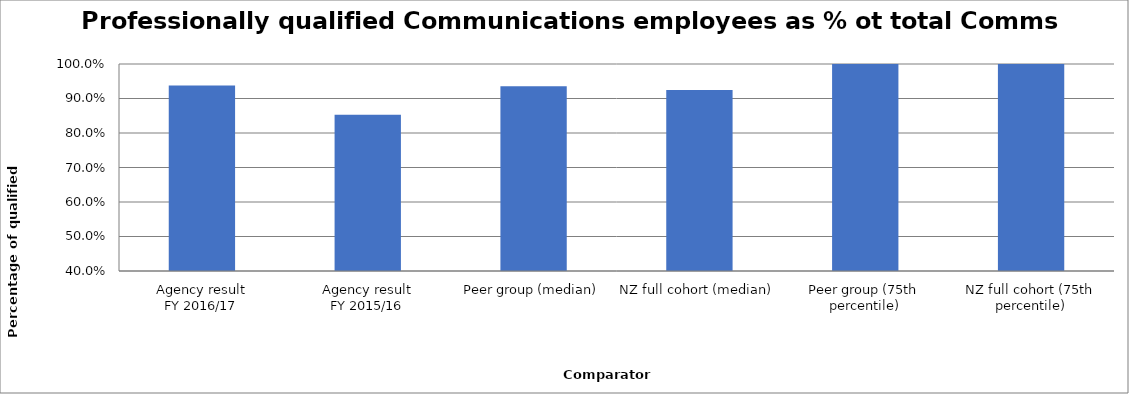
| Category | Result |
|---|---|
| Agency result
FY 2016/17 | 0.938 |
| Agency result
FY 2015/16 | 0.853 |
| Peer group (median) | 0.935 |
| NZ full cohort (median) | 0.925 |
| Peer group (75th percentile) | 1 |
| NZ full cohort (75th percentile) | 1 |